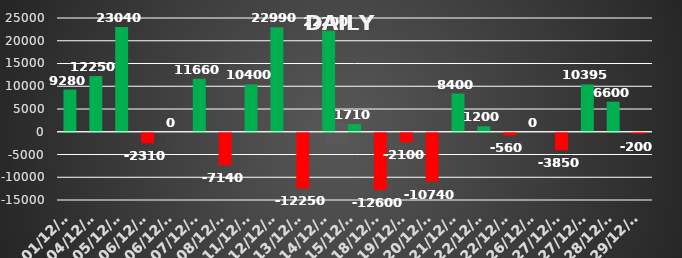
| Category | Series 0 |
|---|---|
| 2023-12-01 | 9280 |
| 2023-12-04 | 12250 |
| 2023-12-05 | 23040 |
| 2023-12-06 | -2310 |
| 2023-12-06 | 0 |
| 2023-12-07 | 11660 |
| 2023-12-08 | -7140 |
| 2023-12-11 | 10400 |
| 2023-12-12 | 22990 |
| 2023-12-13 | -12250 |
| 2023-12-14 | 22200 |
| 2023-12-15 | 1710 |
| 2023-12-18 | -12600 |
| 2023-12-19 | -2100 |
| 2023-12-20 | -10740 |
| 2023-12-21 | 8400 |
| 2023-12-22 | 1200 |
| 2023-12-22 | -560 |
| 2023-12-26 | 0 |
| 2023-12-27 | -3850 |
| 2023-12-27 | 10395 |
| 2023-12-28 | 6600 |
| 2023-12-29 | -200 |